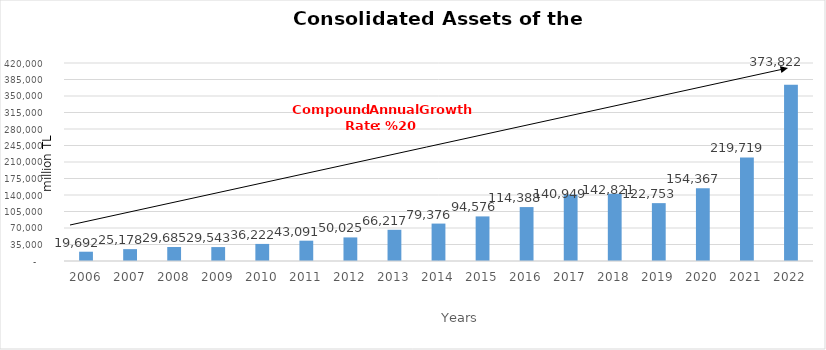
| Category | Total |
|---|---|
| 2006.0 | 19691.807 |
| 2007.0 | 25178.471 |
| 2008.0 | 29685 |
| 2009.0 | 29543.192 |
| 2010.0 | 36222.019 |
| 2011.0 | 43090.622 |
| 2012.0 | 50025.409 |
| 2013.0 | 66217.364 |
| 2014.0 | 79376 |
| 2015.0 | 94576 |
| 2016.0 | 114388 |
| 2017.0 | 140949 |
| 2018.0 | 142821 |
| 2019.0 | 122753 |
| 2020.0 | 154367 |
| 2021.0 | 219719 |
| 2022.0 | 373822 |